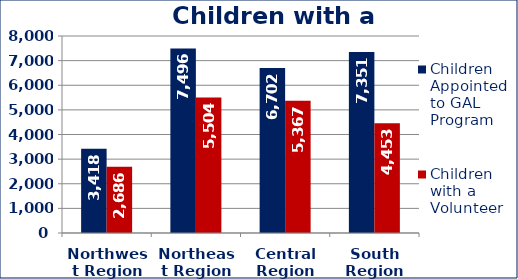
| Category | Children Appointed to GAL Program  | Children with a Volunteer  |
|---|---|---|
| Northwest Region | 3418 | 2686 |
| Northeast Region | 7496 | 5504 |
| Central Region | 6702 | 5367 |
| South Region | 7351 | 4453 |